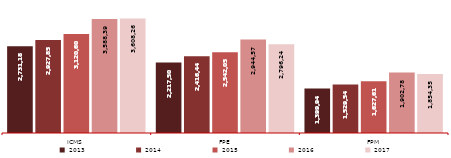
| Category | 2013 | 2014 | 2015 | 2016 | 2017 |
|---|---|---|---|---|---|
| ICMS | 2731181 | 2927851 | 3120602 | 3588392 | 3608269.289 |
| FPE | 2217507 | 2416442.255 | 2542058 | 2944570 | 2796240.798 |
| FPM | 1399946 | 1529545.825 | 1627618 | 1902782 | 1854352.283 |